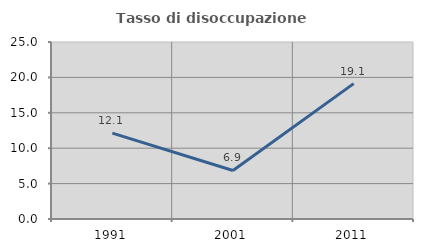
| Category | Tasso di disoccupazione giovanile  |
|---|---|
| 1991.0 | 12.131 |
| 2001.0 | 6.857 |
| 2011.0 | 19.118 |